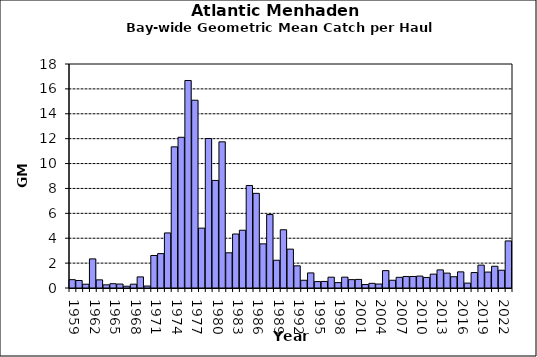
| Category | Series 0 |
|---|---|
| 1959.0 | 0.67 |
| 1960.0 | 0.602 |
| 1961.0 | 0.304 |
| 1962.0 | 2.339 |
| 1963.0 | 0.655 |
| 1964.0 | 0.255 |
| 1965.0 | 0.344 |
| 1966.0 | 0.317 |
| 1967.0 | 0.142 |
| 1968.0 | 0.307 |
| 1969.0 | 0.892 |
| 1970.0 | 0.158 |
| 1971.0 | 2.613 |
| 1972.0 | 2.763 |
| 1973.0 | 4.424 |
| 1974.0 | 11.343 |
| 1975.0 | 12.111 |
| 1976.0 | 16.674 |
| 1977.0 | 15.089 |
| 1978.0 | 4.81 |
| 1979.0 | 12.014 |
| 1980.0 | 8.644 |
| 1981.0 | 11.745 |
| 1982.0 | 2.83 |
| 1983.0 | 4.339 |
| 1984.0 | 4.641 |
| 1985.0 | 8.238 |
| 1986.0 | 7.605 |
| 1987.0 | 3.546 |
| 1988.0 | 5.903 |
| 1989.0 | 2.231 |
| 1990.0 | 4.681 |
| 1991.0 | 3.124 |
| 1992.0 | 1.782 |
| 1993.0 | 0.621 |
| 1994.0 | 1.212 |
| 1995.0 | 0.515 |
| 1996.0 | 0.527 |
| 1997.0 | 0.87 |
| 1998.0 | 0.433 |
| 1999.0 | 0.872 |
| 2000.0 | 0.673 |
| 2001.0 | 0.691 |
| 2002.0 | 0.277 |
| 2003.0 | 0.375 |
| 2004.0 | 0.32 |
| 2005.0 | 1.397 |
| 2006.0 | 0.622 |
| 2007.0 | 0.857 |
| 2008.0 | 0.926 |
| 2009.0 | 0.926 |
| 2010.0 | 0.958 |
| 2011.0 | 0.849 |
| 2012.0 | 1.114 |
| 2013.0 | 1.455 |
| 2014.0 | 1.197 |
| 2015.0 | 0.906 |
| 2016.0 | 1.296 |
| 2017.0 | 0.393 |
| 2018.0 | 1.241 |
| 2019.0 | 1.839 |
| 2020.0 | 1.28 |
| 2021.0 | 1.748 |
| 2022.0 | 1.428 |
| 2023.0 | 3.782 |